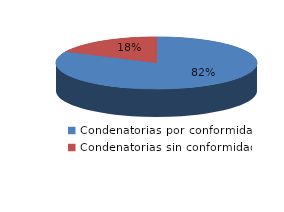
| Category | Series 0 |
|---|---|
| 0 | 580 |
| 1 | 127 |